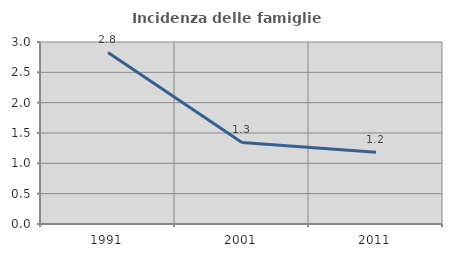
| Category | Incidenza delle famiglie numerose |
|---|---|
| 1991.0 | 2.829 |
| 2001.0 | 1.344 |
| 2011.0 | 1.181 |